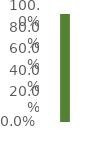
| Category | 1. GESTIÓN INTEGRAL DE ESPECTRO PARA EL INCREMENTO DEL
BIENESTAR SOCIAL del PND |
|---|---|
| Avance | 1 |